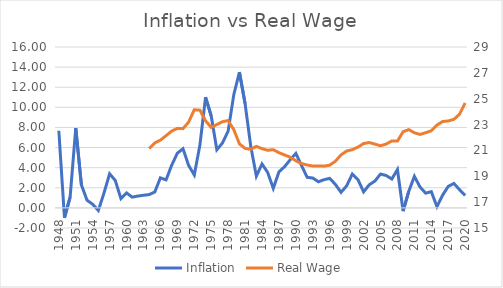
| Category | Inflation |
|---|---|
| 1948.0 | 7.672 |
| 1949.0 | -0.981 |
| 1950.0 | 1.064 |
| 1951.0 | 7.941 |
| 1952.0 | 2.284 |
| 1953.0 | 0.759 |
| 1954.0 | 0.361 |
| 1955.0 | -0.257 |
| 1956.0 | 1.474 |
| 1957.0 | 3.393 |
| 1958.0 | 2.73 |
| 1959.0 | 0.932 |
| 1960.0 | 1.492 |
| 1961.0 | 1.07 |
| 1962.0 | 1.176 |
| 1963.0 | 1.256 |
| 1964.0 | 1.322 |
| 1965.0 | 1.579 |
| 1966.0 | 2.989 |
| 1967.0 | 2.785 |
| 1968.0 | 4.245 |
| 1969.0 | 5.437 |
| 1970.0 | 5.884 |
| 1971.0 | 4.227 |
| 1972.0 | 3.273 |
| 1973.0 | 6.259 |
| 1974.0 | 11.011 |
| 1975.0 | 9.142 |
| 1976.0 | 5.775 |
| 1977.0 | 6.47 |
| 1978.0 | 7.63 |
| 1979.0 | 11.253 |
| 1980.0 | 13.502 |
| 1981.0 | 10.378 |
| 1982.0 | 6.158 |
| 1983.0 | 3.16 |
| 1984.0 | 4.368 |
| 1985.0 | 3.528 |
| 1986.0 | 1.944 |
| 1987.0 | 3.578 |
| 1988.0 | 4.1 |
| 1989.0 | 4.791 |
| 1990.0 | 5.419 |
| 1991.0 | 4.216 |
| 1992.0 | 3.042 |
| 1993.0 | 2.97 |
| 1994.0 | 2.596 |
| 1995.0 | 2.805 |
| 1996.0 | 2.937 |
| 1997.0 | 2.338 |
| 1998.0 | 1.547 |
| 1999.0 | 2.193 |
| 2000.0 | 3.367 |
| 2001.0 | 2.817 |
| 2002.0 | 1.596 |
| 2003.0 | 2.298 |
| 2004.0 | 2.668 |
| 2005.0 | 3.366 |
| 2006.0 | 3.222 |
| 2007.0 | 2.871 |
| 2008.0 | 3.815 |
| 2009.0 | -0.32 |
| 2010.0 | 1.637 |
| 2011.0 | 3.14 |
| 2012.0 | 2.073 |
| 2013.0 | 1.466 |
| 2014.0 | 1.615 |
| 2015.0 | 0.121 |
| 2016.0 | 1.267 |
| 2017.0 | 2.137 |
| 2018.0 | 2.434 |
| 2019.0 | 1.812 |
| 2020.0 | 1.248 |